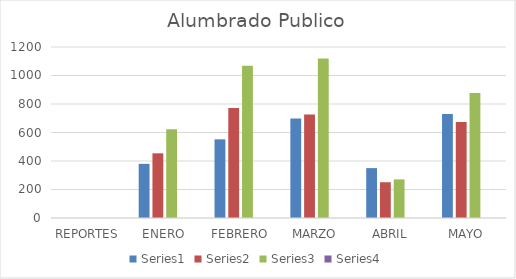
| Category | Series 0 | Series 1 | Series 2 | Series 3 |
|---|---|---|---|---|
| REPORTES | 0 | 0 | 0 |  |
| ENERO | 380 | 454 | 623 |  |
| FEBRERO | 552 | 772 | 1069 |  |
| MARZO | 698 | 727 | 1119 |  |
| ABRIL | 350 | 251 | 271 |  |
| MAYO | 729 | 673 | 878 |  |